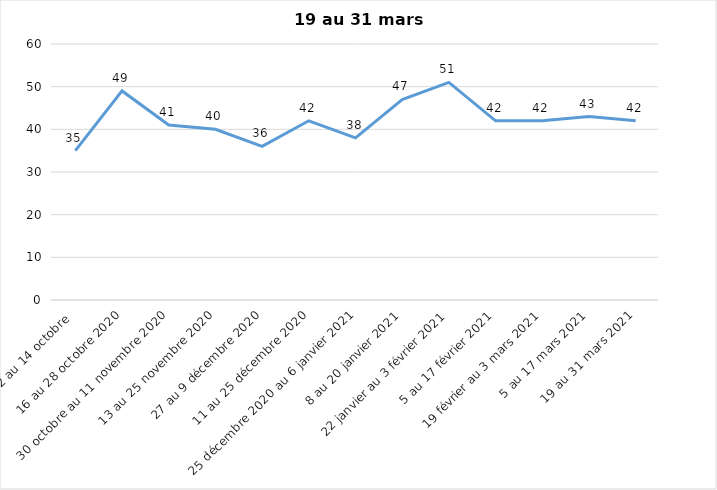
| Category | Toujours aux trois mesures |
|---|---|
| 2 au 14 octobre  | 35 |
| 16 au 28 octobre 2020 | 49 |
| 30 octobre au 11 novembre 2020 | 41 |
| 13 au 25 novembre 2020 | 40 |
| 27 au 9 décembre 2020 | 36 |
| 11 au 25 décembre 2020 | 42 |
| 25 décembre 2020 au 6 janvier 2021 | 38 |
| 8 au 20 janvier 2021 | 47 |
| 22 janvier au 3 février 2021 | 51 |
| 5 au 17 février 2021 | 42 |
| 19 février au 3 mars 2021 | 42 |
| 5 au 17 mars 2021 | 43 |
| 19 au 31 mars 2021 | 42 |